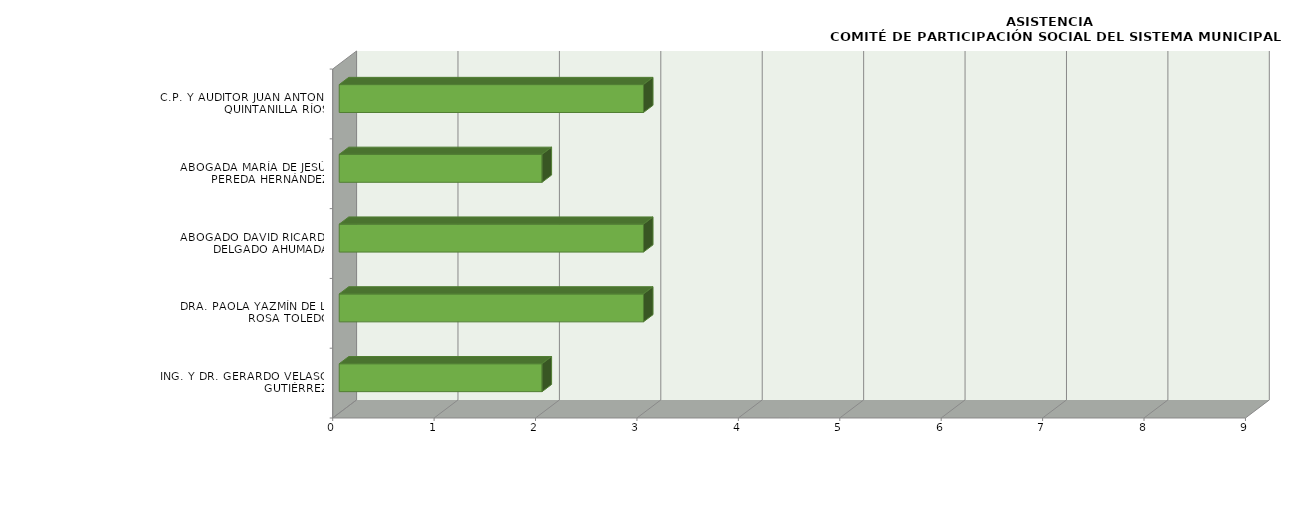
| Category | Series 0 |
|---|---|
| ING. Y DR. GERARDO VELASCO GUTIÉRREZ | 2 |
| DRA. PAOLA YAZMÍN DE LA ROSA TOLEDO | 3 |
| ABOGADO DAVID RICARDO DELGADO AHUMADA | 3 |
| ABOGADA MARÍA DE JESÚS PEREDA HERNÁNDEZ | 2 |
| C.P. Y AUDITOR JUAN ANTONIO QUINTANILLA RÍOS | 3 |